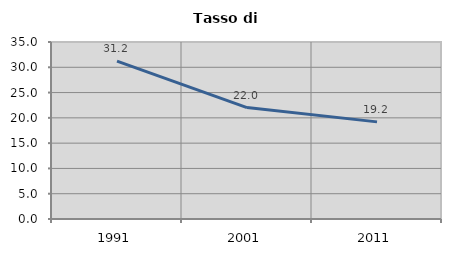
| Category | Tasso di disoccupazione   |
|---|---|
| 1991.0 | 31.217 |
| 2001.0 | 22.04 |
| 2011.0 | 19.206 |